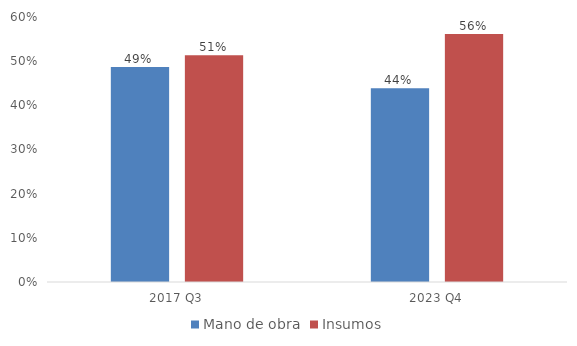
| Category | Mano de obra | Insumos |
|---|---|---|
| 2017 Q3 | 0.487 | 0.513 |
| 2023 Q4 | 0.439 | 0.561 |